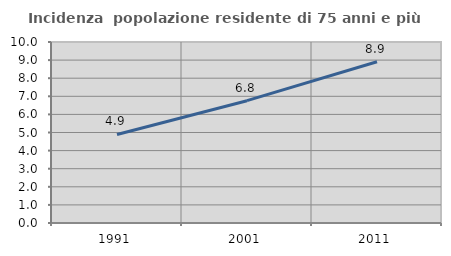
| Category | Incidenza  popolazione residente di 75 anni e più |
|---|---|
| 1991.0 | 4.892 |
| 2001.0 | 6.758 |
| 2011.0 | 8.909 |